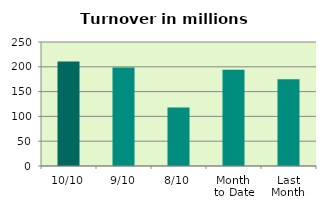
| Category | Series 0 |
|---|---|
| 10/10 | 210.507 |
| 9/10 | 198.689 |
| 8/10 | 118.022 |
| Month 
to Date | 194.053 |
| Last
Month | 174.723 |